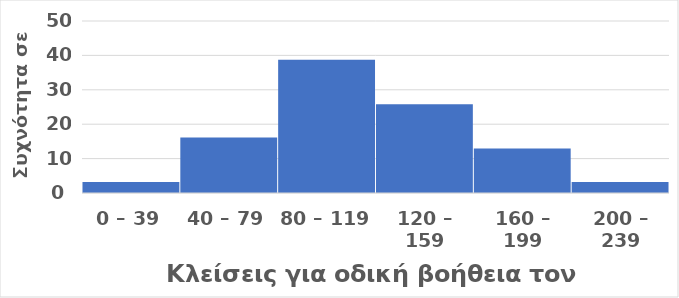
| Category | % |
|---|---|
| 0 – 39 | 3.226 |
| 40 – 79 | 16.129 |
| 80 – 119  | 38.71 |
| 120 – 159 | 25.806 |
| 160 – 199 | 12.903 |
| 200 – 239 | 3.226 |